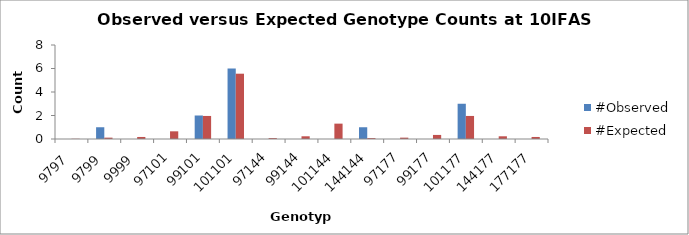
| Category | #Observed | #Expected |
|---|---|---|
| 9797.0 | 0 | 0.019 |
| 9799.0 | 1 | 0.115 |
| 9999.0 | 0 | 0.173 |
| 97101.0 | 0 | 0.654 |
| 99101.0 | 2 | 1.962 |
| 101101.0 | 6 | 5.558 |
| 97144.0 | 0 | 0.077 |
| 99144.0 | 0 | 0.231 |
| 101144.0 | 0 | 1.308 |
| 144144.0 | 1 | 0.077 |
| 97177.0 | 0 | 0.115 |
| 99177.0 | 0 | 0.346 |
| 101177.0 | 3 | 1.962 |
| 144177.0 | 0 | 0.231 |
| 177177.0 | 0 | 0.173 |